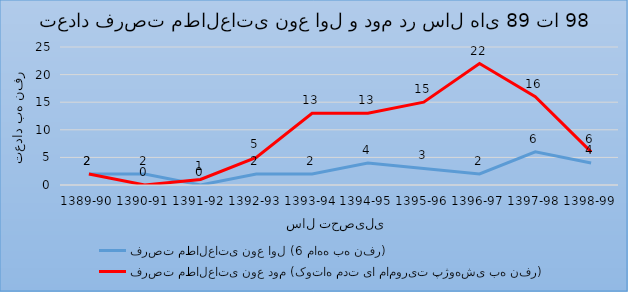
| Category | فرصت مطالعاتی نوع اول (6 ماهه به نفر) | فرصت مطالعاتی نوع دوم (کوتاه مدت یا ماموریت پژوهشی به نفر) |
|---|---|---|
| 1389-90 | 2 | 2 |
| 1390-91 | 2 | 0 |
| 1391-92 | 0 | 1 |
| 1392-93 | 2 | 5 |
| 1393-94 | 2 | 13 |
| 1394-95 | 4 | 13 |
| 1395-96 | 3 | 15 |
| 1396-97 | 2 | 22 |
| 1397-98 | 6 | 16 |
| 1398-99 | 4 | 6 |